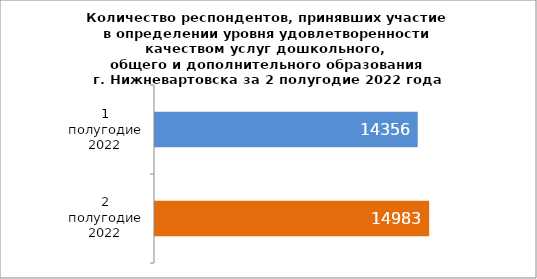
| Category | 1 полугодие 2022 2 полугодие 2022 |
|---|---|
| 1 полугодие 2022 | 14356 |
| 2 полугодие 2022 | 14983 |